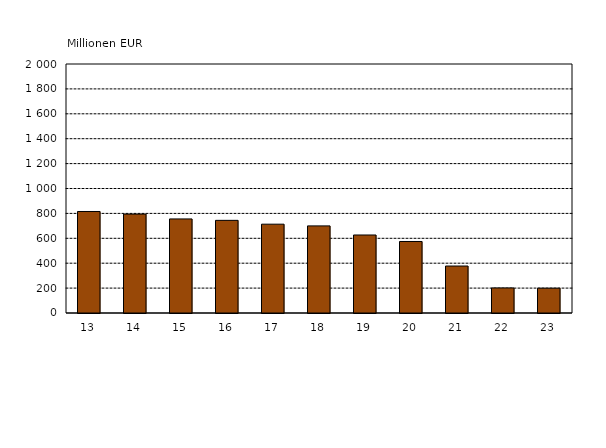
| Category | Series 0 |
|---|---|
| 13 | 815.304 |
| 14 | 794.522 |
| 15 | 755.644 |
| 16 | 744.156 |
| 17 | 713.475 |
| 18 | 699.72 |
| 19 | 626.584 |
| 20 | 574.364 |
| 21 | 377.379 |
| 22 | 201.232 |
| 23 | 199.371 |